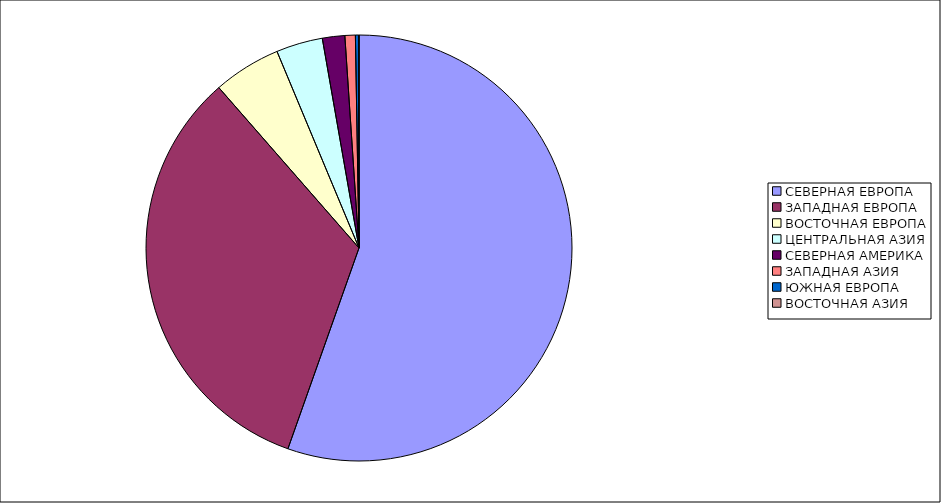
| Category | Оборот |
|---|---|
| СЕВЕРНАЯ ЕВРОПА | 55.41 |
| ЗАПАДНАЯ ЕВРОПА | 33.15 |
| ВОСТОЧНАЯ ЕВРОПА | 5.14 |
| ЦЕНТРАЛЬНАЯ АЗИЯ | 3.53 |
| СЕВЕРНАЯ АМЕРИКА | 1.7 |
| ЗАПАДНАЯ АЗИЯ | 0.79 |
| ЮЖНАЯ ЕВРОПА | 0.26 |
| ВОСТОЧНАЯ АЗИЯ | 0.01 |